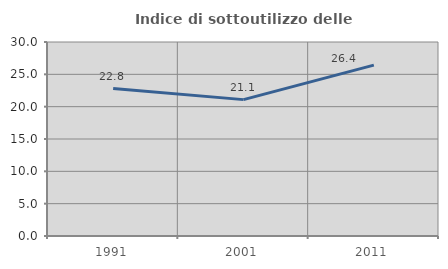
| Category | Indice di sottoutilizzo delle abitazioni  |
|---|---|
| 1991.0 | 22.809 |
| 2001.0 | 21.089 |
| 2011.0 | 26.431 |